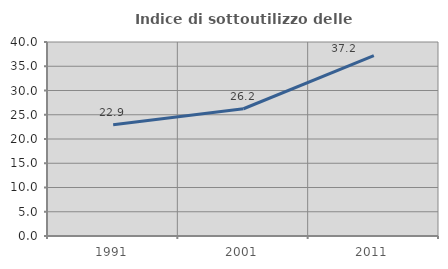
| Category | Indice di sottoutilizzo delle abitazioni  |
|---|---|
| 1991.0 | 22.929 |
| 2001.0 | 26.234 |
| 2011.0 | 37.173 |